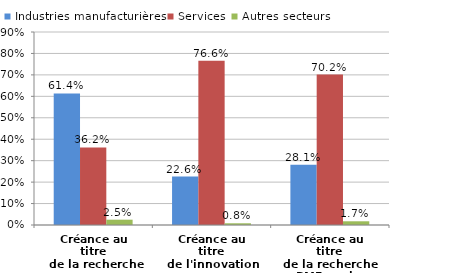
| Category | Industries manufacturières | Services | Autres secteurs |
|---|---|---|---|
| Créance au titre
 de la recherche | 0.614 | 0.362 | 0.025 |
| Créance au titre
de l'innovation | 0.226 | 0.766 | 0.008 |
| Créance au titre
de la recherche
PME seules | 0.281 | 0.702 | 0.017 |